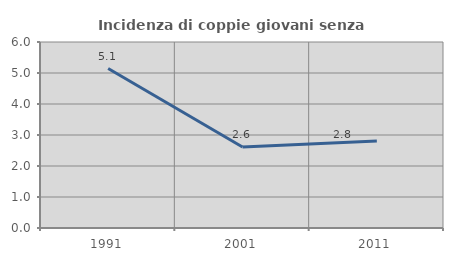
| Category | Incidenza di coppie giovani senza figli |
|---|---|
| 1991.0 | 5.145 |
| 2001.0 | 2.613 |
| 2011.0 | 2.804 |